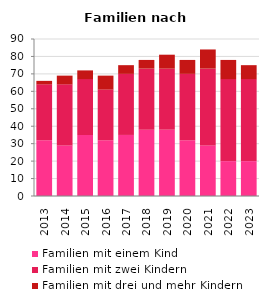
| Category | Familien mit einem Kind | Familien mit zwei Kindern | Familien mit drei und mehr Kindern |
|---|---|---|---|
| 2013.0 | 32 | 32 | 2 |
| 2014.0 | 29 | 35 | 5 |
| 2015.0 | 35 | 32 | 5 |
| 2016.0 | 32 | 29 | 8 |
| 2017.0 | 35 | 35 | 5 |
| 2018.0 | 38 | 35 | 5 |
| 2019.0 | 38 | 35 | 8 |
| 2020.0 | 32 | 38 | 8 |
| 2021.0 | 29 | 44 | 11 |
| 2022.0 | 20 | 47 | 11 |
| 2023.0 | 20 | 47 | 8 |